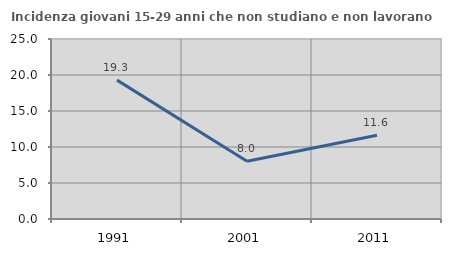
| Category | Incidenza giovani 15-29 anni che non studiano e non lavorano  |
|---|---|
| 1991.0 | 19.286 |
| 2001.0 | 8.025 |
| 2011.0 | 11.644 |